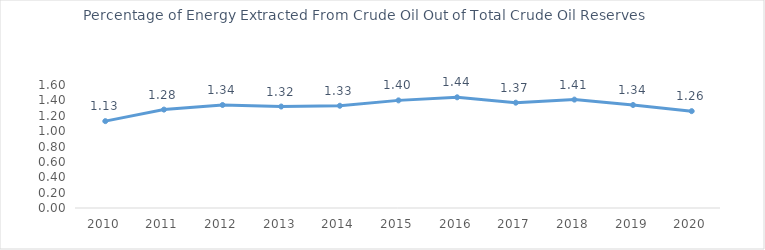
| Category | Percentage of Crude Oil Extraction |
|---|---|
| 2010.0 | 1.13 |
| 2011.0 | 1.28 |
| 2012.0 | 1.34 |
| 2013.0 | 1.32 |
| 2014.0 | 1.33 |
| 2015.0 | 1.4 |
| 2016.0 | 1.44 |
| 2017.0 | 1.37 |
| 2018.0 | 1.41 |
| 2019.0 | 1.34 |
| 2020.0 | 1.26 |